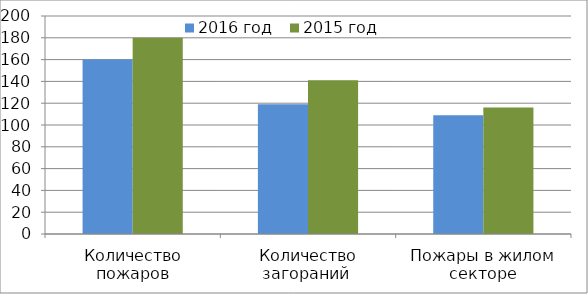
| Category | 2016 год | 2015 год |
|---|---|---|
| Количество пожаров | 160 | 180 |
| Количество загораний  | 119 | 141 |
| Пожары в жилом секторе | 109 | 116 |